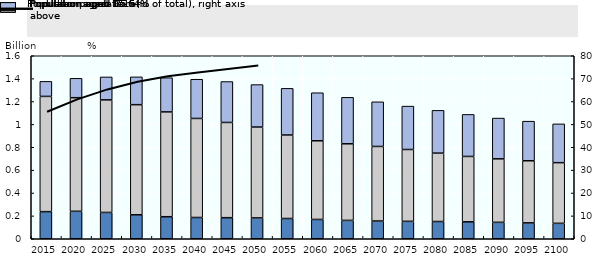
| Category | Population aged 0-15 | Population aged 15-64 | Population aged 65 and above |
|---|---|---|---|
| 2015.0 | 0.237 | 1.008 | 0.131 |
| 2020.0 | 0.24 | 0.993 | 0.17 |
| 2025.0 | 0.23 | 0.984 | 0.201 |
| 2030.0 | 0.21 | 0.963 | 0.243 |
| 2035.0 | 0.193 | 0.916 | 0.299 |
| 2040.0 | 0.186 | 0.866 | 0.343 |
| 2045.0 | 0.184 | 0.833 | 0.358 |
| 2050.0 | 0.182 | 0.795 | 0.371 |
| 2055.0 | 0.177 | 0.73 | 0.408 |
| 2060.0 | 0.169 | 0.688 | 0.42 |
| 2065.0 | 0.161 | 0.67 | 0.406 |
| 2070.0 | 0.155 | 0.652 | 0.391 |
| 2075.0 | 0.152 | 0.628 | 0.379 |
| 2080.0 | 0.151 | 0.598 | 0.374 |
| 2085.0 | 0.148 | 0.572 | 0.367 |
| 2090.0 | 0.144 | 0.555 | 0.356 |
| 2095.0 | 0.139 | 0.543 | 0.346 |
| 2100.0 | 0.135 | 0.53 | 0.339 |